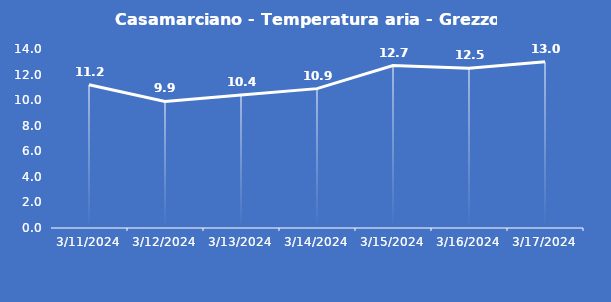
| Category | Casamarciano - Temperatura aria - Grezzo (°C) |
|---|---|
| 3/11/24 | 11.2 |
| 3/12/24 | 9.9 |
| 3/13/24 | 10.4 |
| 3/14/24 | 10.9 |
| 3/15/24 | 12.7 |
| 3/16/24 | 12.5 |
| 3/17/24 | 13 |